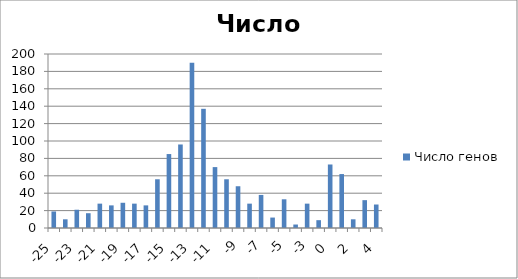
| Category | Число генов |
|---|---|
| -25.0 | 19 |
| -24.0 | 10 |
| -23.0 | 21 |
| -22.0 | 17 |
| -21.0 | 28 |
| -20.0 | 26 |
| -19.0 | 29 |
| -18.0 | 28 |
| -17.0 | 26 |
| -16.0 | 56 |
| -15.0 | 85 |
| -14.0 | 96 |
| -13.0 | 190 |
| -12.0 | 137 |
| -11.0 | 70 |
| -10.0 | 56 |
| -9.0 | 48 |
| -8.0 | 28 |
| -7.0 | 38 |
| -6.0 | 12 |
| -5.0 | 33 |
| -4.0 | 4 |
| -3.0 | 28 |
| -2.0 | 9 |
| 0.0 | 73 |
| 1.0 | 62 |
| 2.0 | 10 |
| 3.0 | 32 |
| 4.0 | 27 |